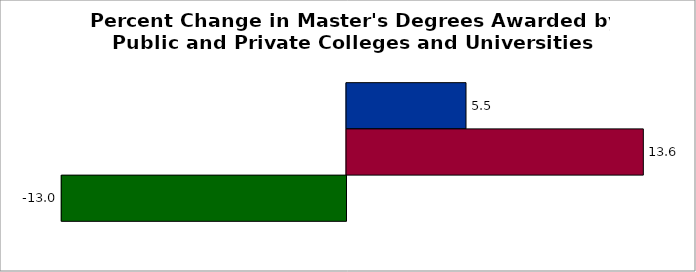
| Category | 50 states and D.C. | SREB states | State |
|---|---|---|---|
| 0 | 5.457 | 13.554 | -13.001 |